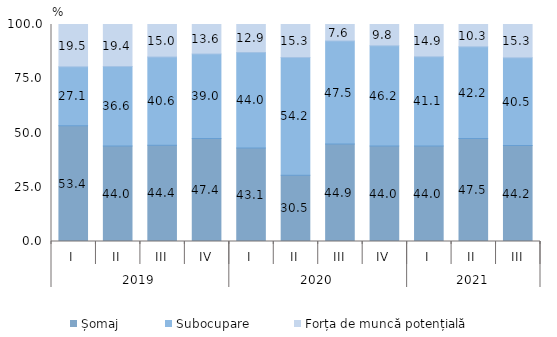
| Category | Șomaj | Subocupare | Forța de muncă potențială |
|---|---|---|---|
| 0 | 53.374 | 27.147 | 19.479 |
| 1 | 43.979 | 36.649 | 19.372 |
| 2 | 44.366 | 40.61 | 15.023 |
| 3 | 47.447 | 38.979 | 13.574 |
| 4 | 43.127 | 44.01 | 12.863 |
| 5 | 30.523 | 54.216 | 15.261 |
| 6 | 44.874 | 47.548 | 7.578 |
| 7 | 44 | 46.2 | 9.8 |
| 8 | 44 | 41.1 | 14.9 |
| 9 | 47.504 | 42.209 | 10.287 |
| 10 | 44.2 | 40.5 | 15.3 |